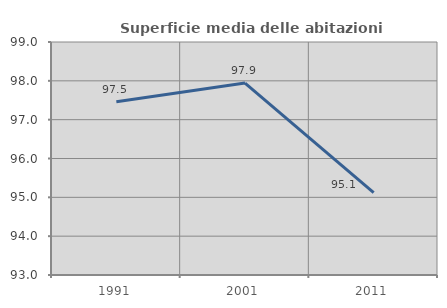
| Category | Superficie media delle abitazioni occupate |
|---|---|
| 1991.0 | 97.462 |
| 2001.0 | 97.942 |
| 2011.0 | 95.12 |